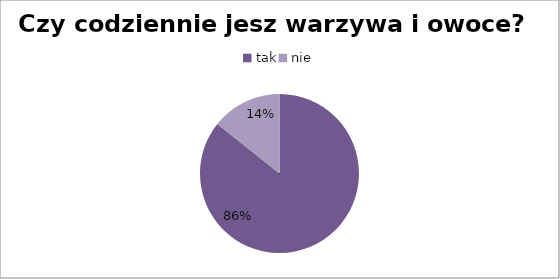
| Category | Czy codziennie jesz warzywa i owoce? |
|---|---|
| tak | 24 |
| nie | 4 |